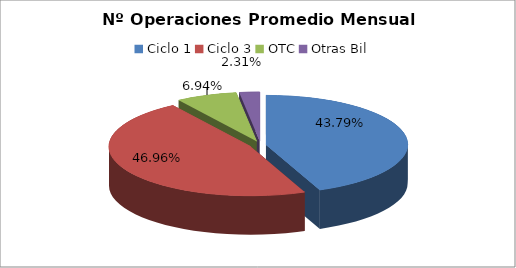
| Category | Series 0 |
|---|---|
| Ciclo 1 | 48045.583 |
| Ciclo 3 | 51527.667 |
| OTC | 7619.083 |
| Otras Bil | 2532.75 |